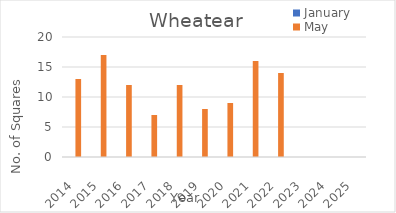
| Category | January | May |
|---|---|---|
| 2014.0 | 0 | 13 |
| 2015.0 | 0 | 17 |
| 2016.0 | 0 | 12 |
| 2017.0 | 0 | 7 |
| 2018.0 | 0 | 12 |
| 2019.0 | 0 | 8 |
| 2020.0 | 0 | 9 |
| 2021.0 | 0 | 16 |
| 2022.0 | 0 | 14 |
| 2023.0 | 0 | 0 |
| 2024.0 | 0 | 0 |
| 2025.0 | 0 | 0 |